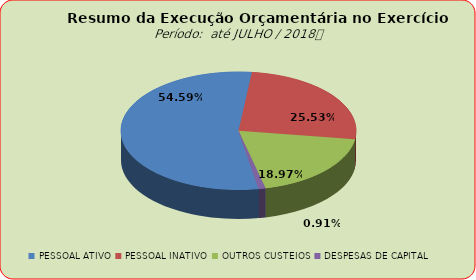
| Category | Series 0 |
|---|---|
| PESSOAL ATIVO | 88275546.09 |
| PESSOAL INATIVO | 41292022.85 |
| OUTROS CUSTEIOS | 30681876.33 |
| DESPESAS DE CAPITAL | 1465912.99 |